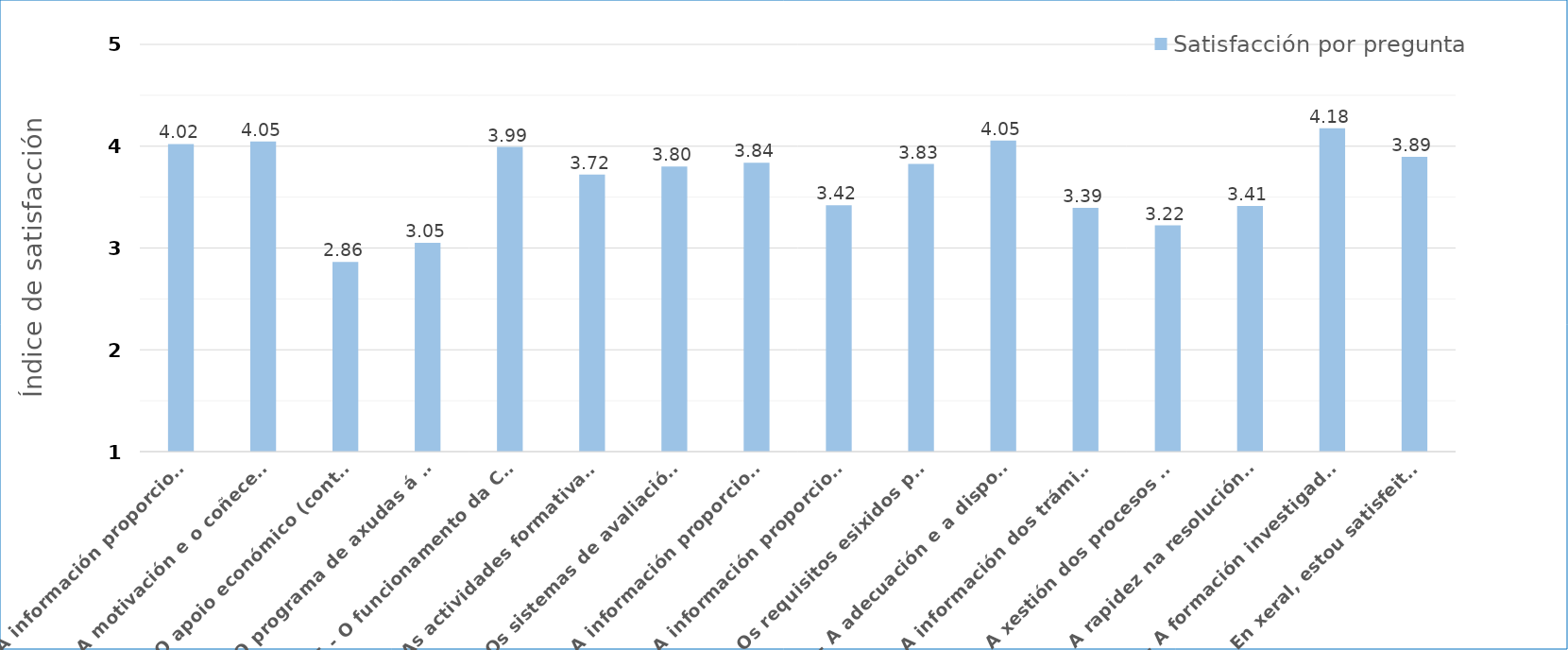
| Category | Satisfacción por pregunta |
|---|---|
| 1 - A información proporcionada pola comisión académica do programa de doutoramento (CAPD) | 4.021 |
| 2 - A motivación e o coñecementos do estudantado matriculado no programa | 4.046 |
| 3 - O apoio económico (contratos, bolsas) aos/ás doutorandos/as | 2.862 |
| 4 - O programa de axudas á mobilidade predoutoral | 3.051 |
| 5 - O funcionamento da CAPD | 3.992 |
| 6 - As actividades formativas para os/as doutorandos/as | 3.722 |
| 7 - Os sistemas de avaliación e seguimento dos/as doutorandos/as | 3.8 |
| 8 - A información proporcionada pola páxina web do programa | 3.838 |
| 9 - A información proporcionada pola páxina web da Escola Internacional de Doutoramento (Eido) | 3.419 |
| 10 - Os requisitos esixidos para acreditar a experiencia investigadora | 3.825 |
| 11 - A adecuación e a dispoñibilidade dos laboratorios, aulas, espazos para talleres, equipamentos especiais, recursos bibliográficos, recursos e redes de telecomunicacións | 4.055 |
| 12 - A información dos trámites relacionados coa tese de doutoramento | 3.394 |
| 13 - A xestión dos procesos administrativos relacionados coa dirección das teses | 3.222 |
| 14 - A rapidez na resolución das incidencias e reclamacións | 3.412 |
| 15 - A formación investigadora adquirida polo estudantado | 4.176 |
| 16 - En xeral, estou satisfeito/a co programa de doutoramento | 3.895 |